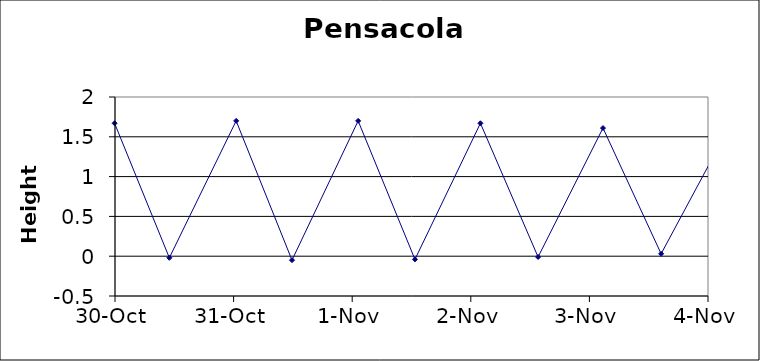
| Category | Height |
|---|---|
| 38288.39166666667 | 0.17 |
| 38288.97430555556 | 1.58 |
| 38289.425 | 0.05 |
| 38289.99652777778 | 1.67 |
| 38290.458333333336 | -0.02 |
| 38291.021527777775 | 1.7 |
| 38291.49236111111 | -0.05 |
| 38292.05 | 1.7 |
| 38292.52916666667 | -0.04 |
| 38293.08125 | 1.67 |
| 38293.56736111111 | -0.01 |
| 38294.114583333336 | 1.61 |
| 38294.60486111111 | 0.03 |
| 38295.14861111111 | 1.54 |
| 38295.638194444444 | 0.08 |
| 38296.18263888889 | 1.44 |
| 38296.66527777778 | 0.16 |
| 38297.21666666667 | 1.31 |
| 38297.683333333334 | 0.27 |
| 38298.25277777778 | 1.13 |
| 38298.68819444445 | 0.43 |
| 38299.30972222222 | 0.91 |
| 38299.66805555556 | 0.6 |
| 38299.959027777775 | 0.84 |
| 38300.25902777778 | 0.63 |
| 38300.92013888889 | 1.03 |
| 38301.30763888889 | 0.34 |
| 38301.876388888886 | 1.28 |
| 38302.30347222222 | 0.06 |